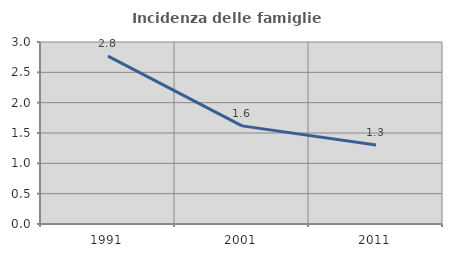
| Category | Incidenza delle famiglie numerose |
|---|---|
| 1991.0 | 2.767 |
| 2001.0 | 1.618 |
| 2011.0 | 1.301 |